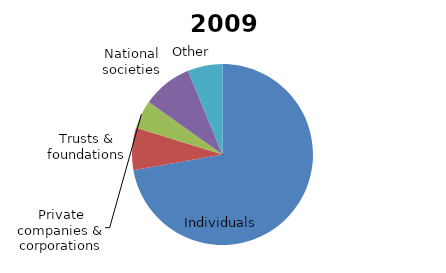
| Category | 2009 |
|---|---|
| Individuals | 0.722 |
| Trusts & foundations | 0.076 |
| Private companies & corporations | 0.051 |
| National societies | 0.089 |
| Other | 0.062 |